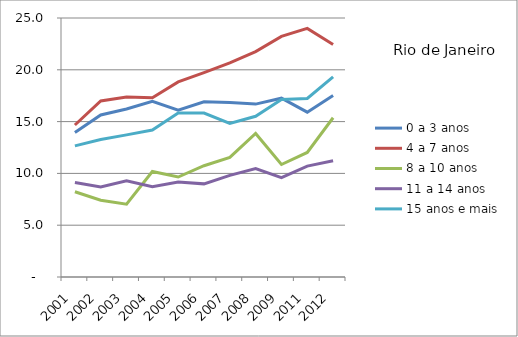
| Category | 0 a 3 anos | 4 a 7 anos | 8 a 10 anos | 11 a 14 anos | 15 anos e mais |
|---|---|---|---|---|---|
| 2001.0 | 13.95 | 14.67 | 8.23 | 9.13 | 12.66 |
| 2002.0 | 15.64 | 16.99 | 7.41 | 8.7 | 13.27 |
| 2003.0 | 16.22 | 17.37 | 7.03 | 9.29 | 13.72 |
| 2004.0 | 16.95 | 17.3 | 10.18 | 8.72 | 14.19 |
| 2005.0 | 16.11 | 18.83 | 9.65 | 9.16 | 15.84 |
| 2006.0 | 16.91 | 19.72 | 10.74 | 8.99 | 15.82 |
| 2007.0 | 16.84 | 20.67 | 11.55 | 9.81 | 14.82 |
| 2008.0 | 16.69 | 21.76 | 13.85 | 10.47 | 15.51 |
| 2009.0 | 17.26 | 23.22 | 10.86 | 9.59 | 17.13 |
| 2011.0 | 15.91 | 24 | 12.02 | 10.7 | 17.23 |
| 2012.0 | 17.51 | 22.45 | 15.37 | 11.22 | 19.31 |